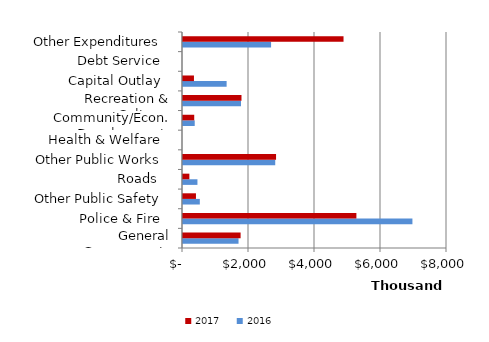
| Category | 2016 | 2017 |
|---|---|---|
|  General Government  | 1682686 | 1745623 |
|  Police & Fire  | 6952252 | 5254447 |
|  Other Public Safety  | 509627 | 392573 |
|  Roads   | 437642 | 193064 |
|  Other Public Works  | 2794966 | 2819889 |
|  Health & Welfare  | 0 | 0 |
|  Community/Econ. Development  | 355467 | 340292 |
|  Recreation & Culture  | 1757119 | 1772415 |
|  Capital Outlay  | 1321869 | 331914 |
|  Debt Service  | 0 | 0 |
|  Other Expenditures  | 2668988 | 4864378 |